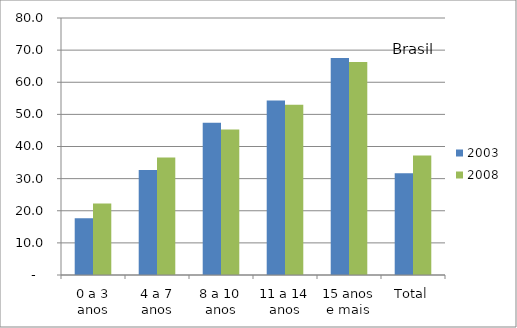
| Category | 2003 | 2008 |
|---|---|---|
| 0 a 3 anos | 17.63 | 22.23 |
| 4 a 7 anos | 32.72 | 36.61 |
| 8 a 10 anos | 47.37 | 45.29 |
| 11 a 14 anos | 54.33 | 53.02 |
| 15 anos e mais | 67.55 | 66.3 |
| Total | 31.71 | 37.22 |